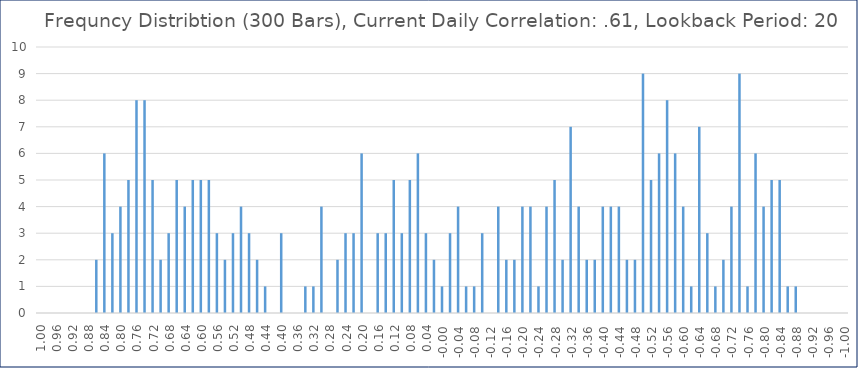
| Category | Series 0 |
|---|---|
| 1.0 | 0 |
| 0.98 | 0 |
| 0.96 | 0 |
| 0.94 | 0 |
| 0.9199999999999999 | 0 |
| 0.8999999999999999 | 0 |
| 0.8799999999999999 | 0 |
| 0.8599999999999999 | 2 |
| 0.8399999999999999 | 6 |
| 0.8199999999999998 | 3 |
| 0.7999999999999998 | 4 |
| 0.7799999999999998 | 5 |
| 0.7599999999999998 | 8 |
| 0.7399999999999998 | 8 |
| 0.7199999999999998 | 5 |
| 0.6999999999999997 | 2 |
| 0.6799999999999997 | 3 |
| 0.6599999999999997 | 5 |
| 0.6399999999999997 | 4 |
| 0.6199999999999997 | 5 |
| 0.5999999999999996 | 5 |
| 0.5799999999999996 | 5 |
| 0.5599999999999996 | 3 |
| 0.5399999999999996 | 2 |
| 0.5199999999999996 | 3 |
| 0.49999999999999956 | 4 |
| 0.47999999999999954 | 3 |
| 0.4599999999999995 | 2 |
| 0.4399999999999995 | 1 |
| 0.4199999999999995 | 0 |
| 0.39999999999999947 | 3 |
| 0.37999999999999945 | 0 |
| 0.35999999999999943 | 0 |
| 0.3399999999999994 | 1 |
| 0.3199999999999994 | 1 |
| 0.2999999999999994 | 4 |
| 0.27999999999999936 | 0 |
| 0.25999999999999934 | 2 |
| 0.23999999999999935 | 3 |
| 0.21999999999999936 | 3 |
| 0.19999999999999937 | 6 |
| 0.17999999999999938 | 0 |
| 0.1599999999999994 | 3 |
| 0.1399999999999994 | 3 |
| 0.1199999999999994 | 5 |
| 0.0999999999999994 | 3 |
| 0.07999999999999939 | 5 |
| 0.05999999999999939 | 6 |
| 0.03999999999999938 | 3 |
| 0.019999999999999383 | 2 |
| -6.175615574477433e-16 | 1 |
| -0.020000000000000618 | 3 |
| -0.04000000000000062 | 4 |
| -0.06000000000000062 | 1 |
| -0.08000000000000063 | 1 |
| -0.10000000000000063 | 3 |
| -0.12000000000000063 | 0 |
| -0.14000000000000062 | 4 |
| -0.16000000000000061 | 2 |
| -0.1800000000000006 | 2 |
| -0.2000000000000006 | 4 |
| -0.22000000000000058 | 4 |
| -0.24000000000000057 | 1 |
| -0.26000000000000056 | 4 |
| -0.2800000000000006 | 5 |
| -0.3000000000000006 | 2 |
| -0.3200000000000006 | 7 |
| -0.34000000000000064 | 4 |
| -0.36000000000000065 | 2 |
| -0.38000000000000067 | 2 |
| -0.4000000000000007 | 4 |
| -0.4200000000000007 | 4 |
| -0.4400000000000007 | 4 |
| -0.46000000000000074 | 2 |
| -0.48000000000000076 | 2 |
| -0.5000000000000008 | 9 |
| -0.5200000000000008 | 5 |
| -0.5400000000000008 | 6 |
| -0.5600000000000008 | 8 |
| -0.5800000000000008 | 6 |
| -0.6000000000000009 | 4 |
| -0.6200000000000009 | 1 |
| -0.6400000000000009 | 7 |
| -0.6600000000000009 | 3 |
| -0.6800000000000009 | 1 |
| -0.700000000000001 | 2 |
| -0.720000000000001 | 4 |
| -0.740000000000001 | 9 |
| -0.760000000000001 | 1 |
| -0.780000000000001 | 6 |
| -0.800000000000001 | 4 |
| -0.8200000000000011 | 5 |
| -0.8400000000000011 | 5 |
| -0.8600000000000011 | 1 |
| -0.8800000000000011 | 1 |
| -0.9000000000000011 | 0 |
| -0.9200000000000012 | 0 |
| -0.9400000000000012 | 0 |
| -0.9600000000000012 | 0 |
| -0.9800000000000012 | 0 |
| -1.000000000000001 | 0 |